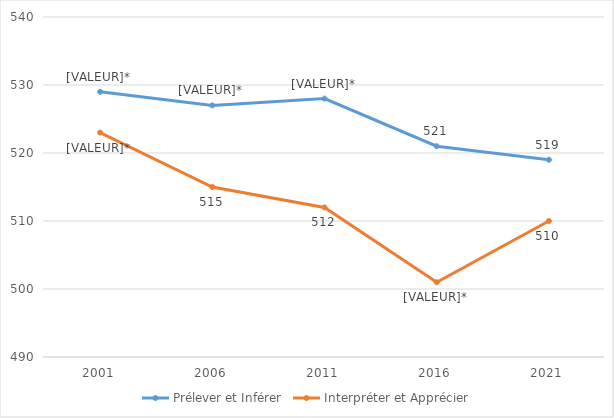
| Category | Prélever et Inférer | Interpréter et Apprécier |
|---|---|---|
| 2001.0 | 529 | 523 |
| 2006.0 | 527 | 515 |
| 2011.0 | 528 | 512 |
| 2016.0 | 521 | 501 |
| 2021.0 | 519 | 510 |